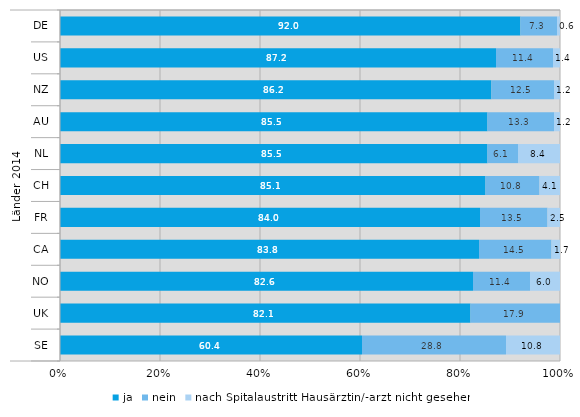
| Category | ja | nein | nach Spitalaustritt Hausärztin/-arzt nicht gesehen |
|---|---|---|---|
| 0 | 92 | 7.3 | 0.6 |
| 1 | 87.2 | 11.4 | 1.4 |
| 2 | 86.2 | 12.5 | 1.2 |
| 3 | 85.5 | 13.3 | 1.2 |
| 4 | 85.5 | 6.1 | 8.4 |
| 5 | 85.1 | 10.8 | 4.1 |
| 6 | 84 | 13.5 | 2.5 |
| 7 | 83.8 | 14.5 | 1.7 |
| 8 | 82.6 | 11.4 | 6 |
| 9 | 82.1 | 17.9 | 0 |
| 10 | 60.4 | 28.8 | 10.8 |